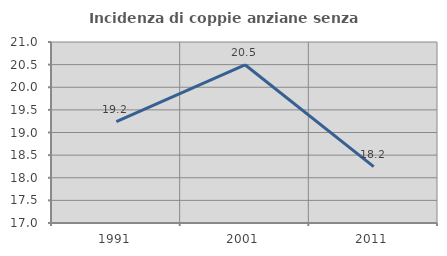
| Category | Incidenza di coppie anziane senza figli  |
|---|---|
| 1991.0 | 19.242 |
| 2001.0 | 20.497 |
| 2011.0 | 18.246 |